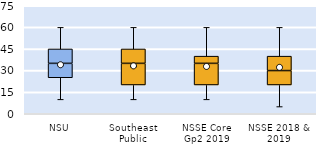
| Category | 25th | 50th | 75th |
|---|---|---|---|
| NSU | 25 | 10 | 10 |
| Southeast Public | 20 | 15 | 10 |
| NSSE Core Gp2 2019 | 20 | 15 | 5 |
| NSSE 2018 & 2019 | 20 | 10 | 10 |